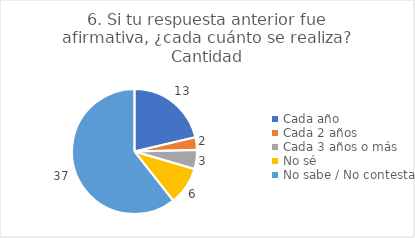
| Category | 6. Si tu respuesta anterior fue afirmativa, ¿cada cuánto se realiza? |
|---|---|
| Cada año  | 0.213 |
| Cada 2 años  | 0.033 |
| Cada 3 años o más  | 0.049 |
| No sé  | 0.098 |
| No sabe / No contesta | 0.607 |